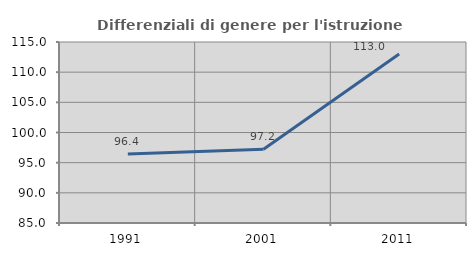
| Category | Differenziali di genere per l'istruzione superiore |
|---|---|
| 1991.0 | 96.427 |
| 2001.0 | 97.232 |
| 2011.0 | 113.02 |